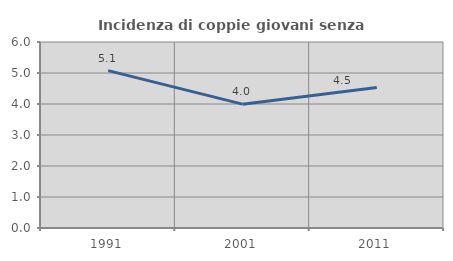
| Category | Incidenza di coppie giovani senza figli |
|---|---|
| 1991.0 | 5.077 |
| 2001.0 | 3.995 |
| 2011.0 | 4.536 |